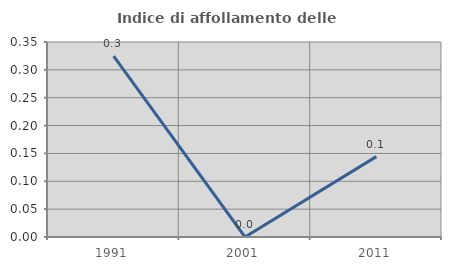
| Category | Indice di affollamento delle abitazioni  |
|---|---|
| 1991.0 | 0.325 |
| 2001.0 | 0 |
| 2011.0 | 0.144 |